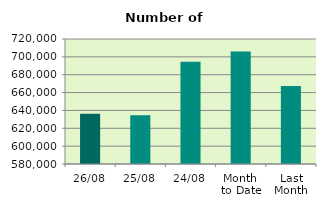
| Category | Series 0 |
|---|---|
| 26/08 | 636340 |
| 25/08 | 634738 |
| 24/08 | 694582 |
| Month 
to Date | 706138.737 |
| Last
Month | 667427.091 |